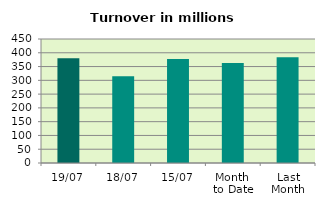
| Category | Series 0 |
|---|---|
| 19/07 | 380.361 |
| 18/07 | 315.038 |
| 15/07 | 377.472 |
| Month 
to Date | 362.526 |
| Last
Month | 384.158 |